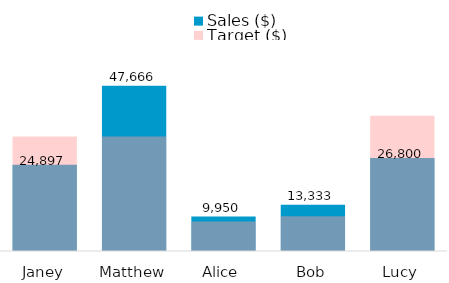
| Category | Sales ($) | Target ($) |
|---|---|---|
| Janey | 24897 | 33000 |
| Matthew | 47666 | 33000 |
| Alice | 9950 | 8500 |
| Bob | 13333 | 10000 |
| Lucy | 26800 | 39000 |